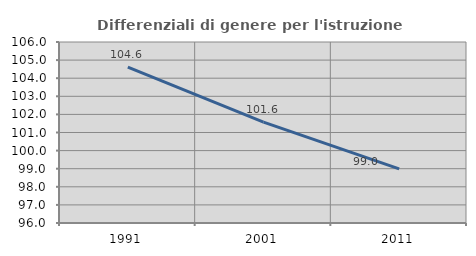
| Category | Differenziali di genere per l'istruzione superiore |
|---|---|
| 1991.0 | 104.611 |
| 2001.0 | 101.57 |
| 2011.0 | 98.988 |